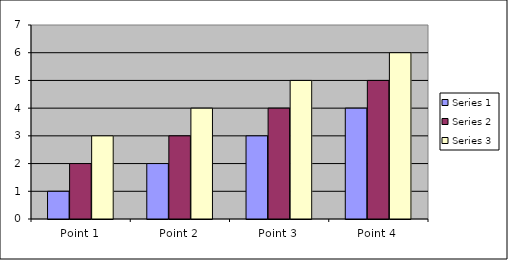
| Category | Series 1 | Series 2 | Series 3 |
|---|---|---|---|
| Point 1 | 1 | 2 | 3 |
| Point 2 | 2 | 3 | 4 |
| Point 3 | 3 | 4 | 5 |
| Point 4 | 4 | 5 | 6 |